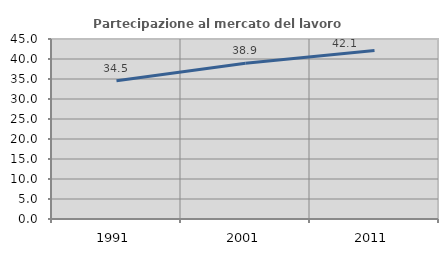
| Category | Partecipazione al mercato del lavoro  femminile |
|---|---|
| 1991.0 | 34.54 |
| 2001.0 | 38.922 |
| 2011.0 | 42.111 |